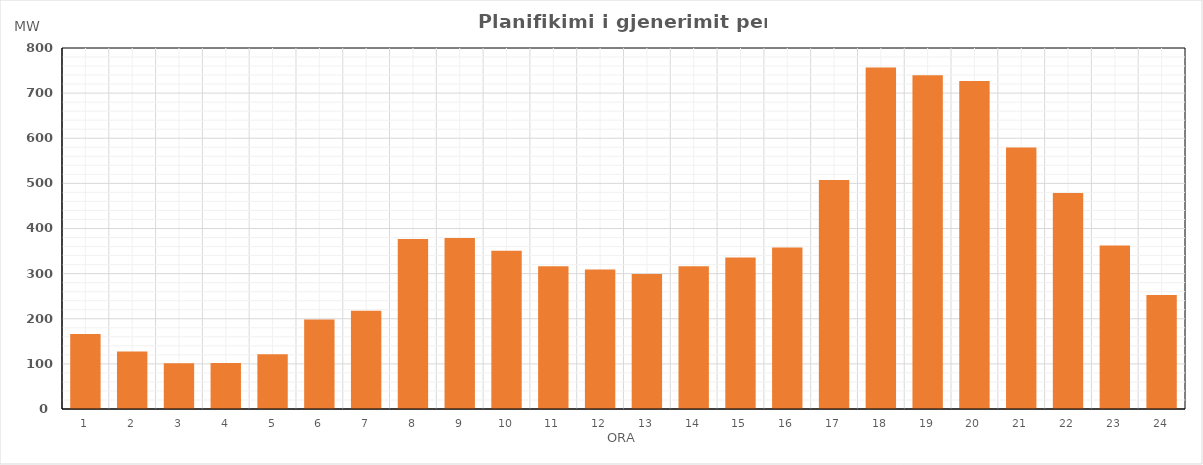
| Category | Max (MW) |
|---|---|
| 0 | 166.3 |
| 1 | 127.3 |
| 2 | 101.3 |
| 3 | 102.1 |
| 4 | 121.1 |
| 5 | 198.3 |
| 6 | 217.5 |
| 7 | 376.7 |
| 8 | 378.7 |
| 9 | 350.7 |
| 10 | 316.2 |
| 11 | 309 |
| 12 | 299.2 |
| 13 | 316.4 |
| 14 | 335.7 |
| 15 | 357.7 |
| 16 | 507.7 |
| 17 | 756.7 |
| 18 | 739.7 |
| 19 | 726.7 |
| 20 | 579.7 |
| 21 | 478.7 |
| 22 | 362.5 |
| 23 | 252.5 |